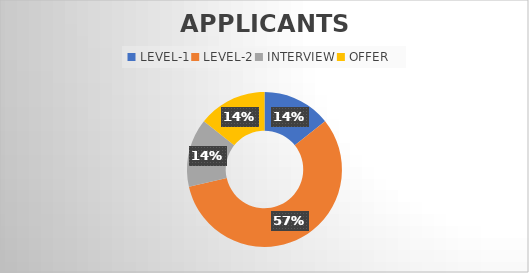
| Category | Series 0 |
|---|---|
| LEVEL-1 | 1 |
| LEVEL-2 | 4 |
| INTERVIEW | 1 |
| OFFER | 1 |